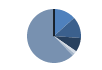
| Category | Series 0 |
|---|---|
| ARRASTRE | 116 |
| CERCO | 112 |
| PALANGRE | 73 |
| REDES DE ENMALLE | 15 |
| ARTES FIJAS | 13 |
| ARTES MENORES | 541 |
| SIN TIPO ASIGNADO | 0 |